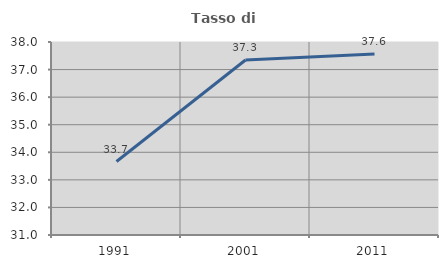
| Category | Tasso di occupazione   |
|---|---|
| 1991.0 | 33.665 |
| 2001.0 | 37.347 |
| 2011.0 | 37.567 |